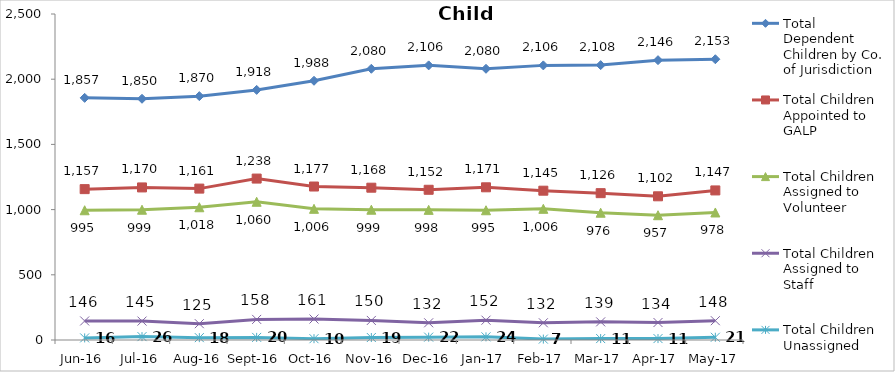
| Category | Total Dependent Children by Co. of Jurisdiction | Total Children Appointed to GALP | Total Children Assigned to Volunteer | Total Children Assigned to Staff | Total Children Unassigned |
|---|---|---|---|---|---|
| Jun-16 | 1857 | 1157 | 995 | 146 | 16 |
| Jul-16 | 1850 | 1170 | 999 | 145 | 26 |
| Aug-16 | 1870 | 1161 | 1018 | 125 | 18 |
| Sep-16 | 1918 | 1238 | 1060 | 158 | 20 |
| Oct-16 | 1988 | 1177 | 1006 | 161 | 10 |
| Nov-16 | 2080 | 1168 | 999 | 150 | 19 |
| Dec-16 | 2106 | 1152 | 998 | 132 | 22 |
| Jan-17 | 2080 | 1171 | 995 | 152 | 24 |
| Feb-17 | 2106 | 1145 | 1006 | 132 | 7 |
| Mar-17 | 2108 | 1126 | 976 | 139 | 11 |
| Apr-17 | 2146 | 1102 | 957 | 134 | 11 |
| May-17 | 2153 | 1147 | 978 | 148 | 21 |